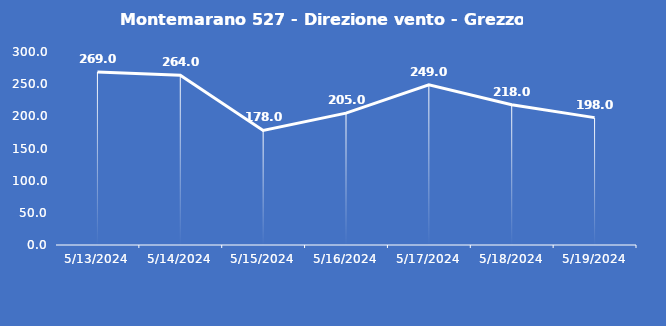
| Category | Montemarano 527 - Direzione vento - Grezzo (°N) |
|---|---|
| 5/13/24 | 269 |
| 5/14/24 | 264 |
| 5/15/24 | 178 |
| 5/16/24 | 205 |
| 5/17/24 | 249 |
| 5/18/24 | 218 |
| 5/19/24 | 198 |